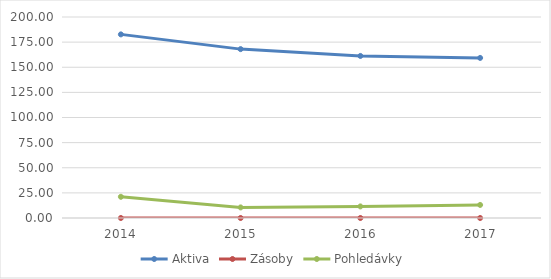
| Category | Aktiva | Zásoby | Pohledávky |
|---|---|---|---|
| 2017.0 | 159.283 | 0 | 13.009 |
| 2016.0 | 161.249 | 0 | 11.523 |
| 2015.0 | 168.041 | 0 | 10.527 |
| 2014.0 | 182.703 | 0 | 21.108 |